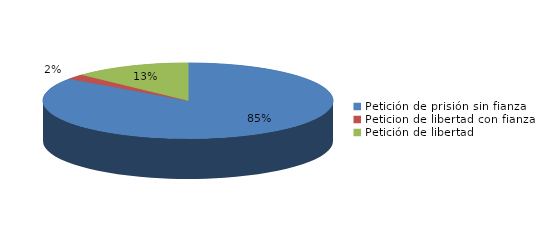
| Category | Series 0 |
|---|---|
| Petición de prisión sin fianza | 78 |
| Peticion de libertad con fianza | 2 |
| Petición de libertad | 12 |